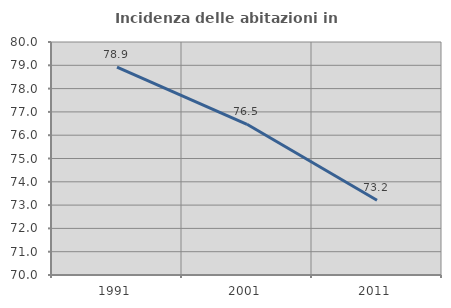
| Category | Incidenza delle abitazioni in proprietà  |
|---|---|
| 1991.0 | 78.926 |
| 2001.0 | 76.469 |
| 2011.0 | 73.208 |